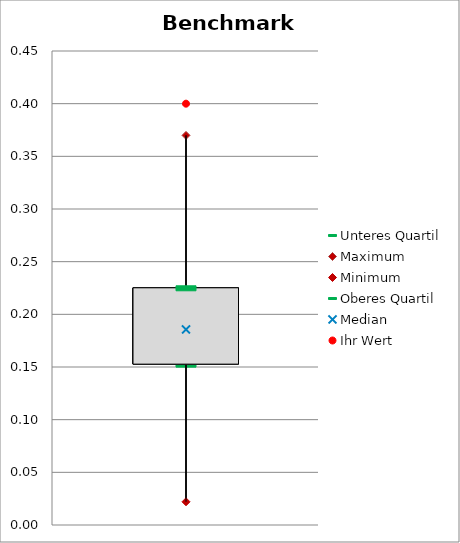
| Category | Unteres Quartil | Maximum | Minimum | Oberes Quartil |
|---|---|---|---|---|
| LP/EW | 0.153 | 0.37 | 0.022 | 0.225 |